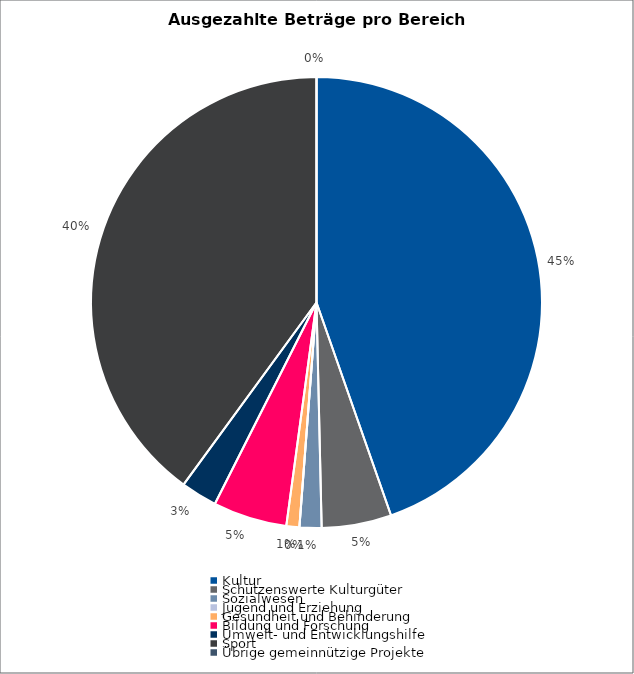
| Category | Series 0 |
|---|---|
| Kultur | 873365 |
| Schützenswerte Kulturgüter | 97736 |
| Sozialwesen | 30805 |
| Jugend und Erziehung | 0 |
| Gesundheit und Behinderung | 18140 |
| Bildung und Forschung | 103689 |
| Umwelt- und Entwicklungshilfe | 50816 |
| Sport | 781937 |
| Übrige gemeinnützige Projekte | 0 |